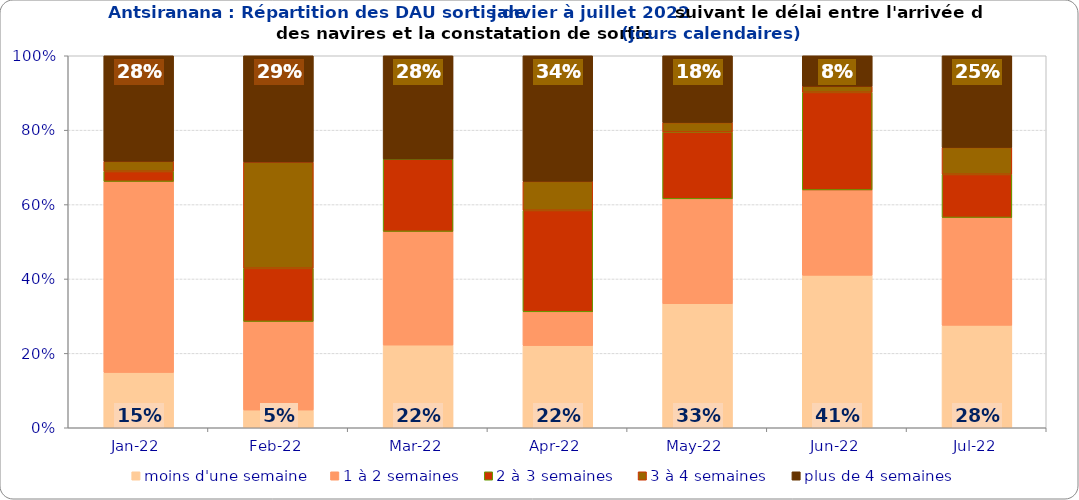
| Category | moins d'une semaine | 1 à 2 semaines | 2 à 3 semaines | 3 à 4 semaines | plus de 4 semaines |
|---|---|---|---|---|---|
| 2022-01-01 | 0.149 | 0.514 | 0.027 | 0.027 | 0.284 |
| 2022-02-01 | 0.048 | 0.238 | 0.143 | 0.286 | 0.286 |
| 2022-03-01 | 0.222 | 0.306 | 0.194 | 0 | 0.278 |
| 2022-04-01 | 0.221 | 0.091 | 0.273 | 0.078 | 0.338 |
| 2022-05-01 | 0.333 | 0.282 | 0.179 | 0.026 | 0.179 |
| 2022-06-01 | 0.41 | 0.23 | 0.262 | 0.016 | 0.082 |
| 2022-07-01 | 0.275 | 0.29 | 0.116 | 0.072 | 0.246 |